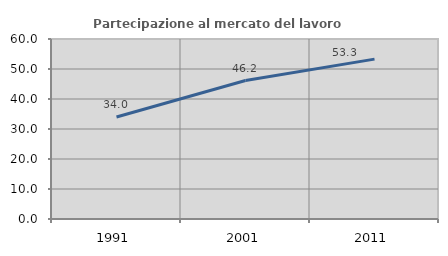
| Category | Partecipazione al mercato del lavoro  femminile |
|---|---|
| 1991.0 | 34.016 |
| 2001.0 | 46.154 |
| 2011.0 | 53.294 |